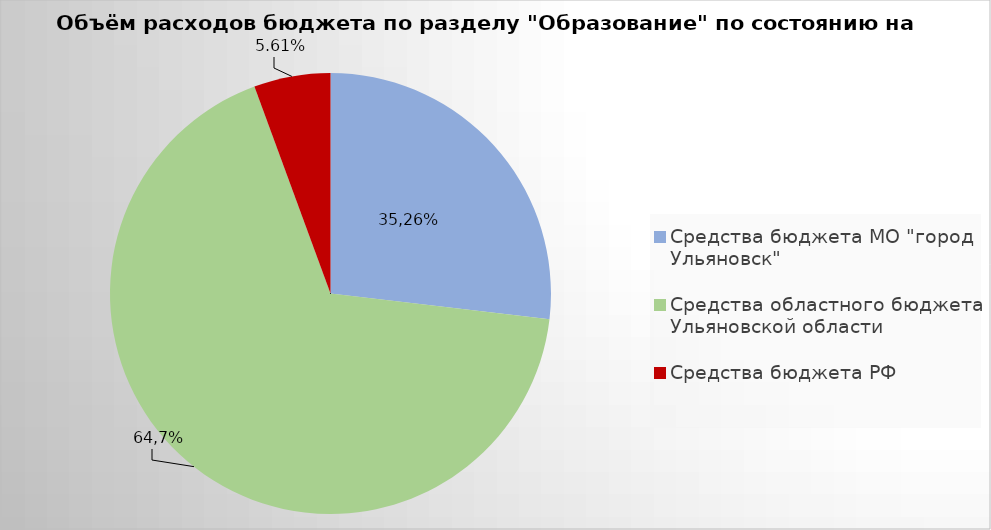
| Category | Series 0 |
|---|---|
| Средства бюджета МО "город Ульяновск" | 2056432.97 |
| Средства областного бюджета Ульяновской области | 5170618.38 |
| Средства бюджета РФ | 429251.76 |